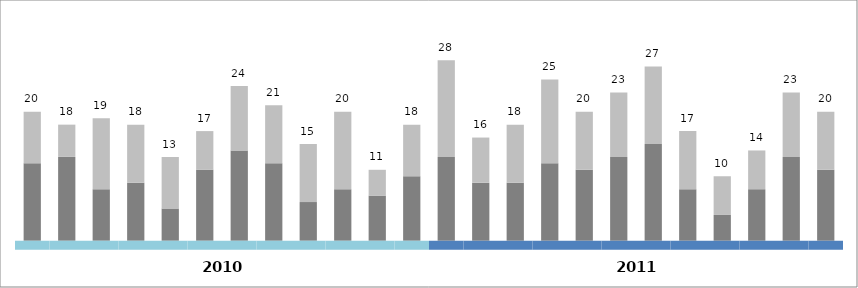
| Category | Artikel A | Artikel B |
|---|---|---|
| 0 | 12 | 8 |
| 1 | 13 | 5 |
| 2 | 8 | 11 |
| 3 | 9 | 9 |
| 4 | 5 | 8 |
| 5 | 11 | 6 |
| 6 | 14 | 10 |
| 7 | 12 | 9 |
| 8 | 6 | 9 |
| 9 | 8 | 12 |
| 10 | 7 | 4 |
| 11 | 10 | 8 |
| 12 | 13 | 15 |
| 13 | 9 | 7 |
| 14 | 9 | 9 |
| 15 | 12 | 13 |
| 16 | 11 | 9 |
| 17 | 13 | 10 |
| 18 | 15 | 12 |
| 19 | 8 | 9 |
| 20 | 4 | 6 |
| 21 | 8 | 6 |
| 22 | 13 | 10 |
| 23 | 11 | 9 |